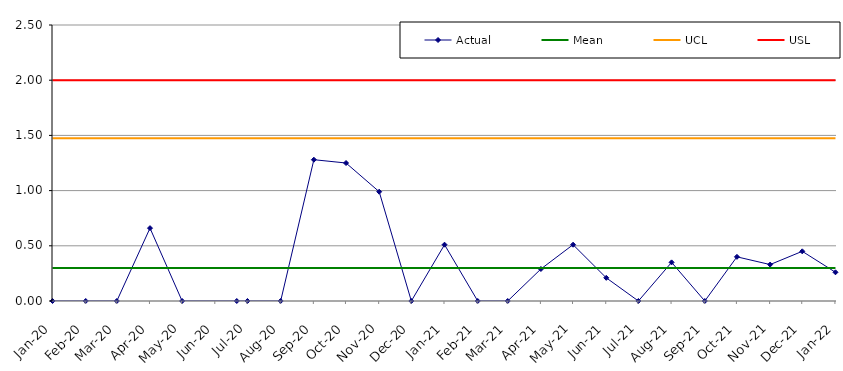
| Category | Actual | Mean | UCL | USL |
|---|---|---|---|---|
| 2020-01-01 | 0 | 0.3 | 1.475 | 2 |
| 2020-02-01 | 0 | 0.3 | 1.475 | 2 |
| 2020-03-01 | 0 | 0.3 | 1.475 | 2 |
| 2020-04-01 | 0.66 | 0.3 | 1.475 | 2 |
| 2020-05-01 | 0 | 0.3 | 1.475 | 2 |
| 2020-06-21 | 0 | 0.3 | 1.475 | 2 |
| 2020-07-01 | 0 | 0.3 | 1.475 | 2 |
| 2020-08-01 | 0 | 0.3 | 1.475 | 2 |
| 2020-09-01 | 1.28 | 0.3 | 1.475 | 2 |
| 2020-10-01 | 1.25 | 0.3 | 1.475 | 2 |
| 2020-11-01 | 0.99 | 0.3 | 1.475 | 2 |
| 2020-12-01 | 0 | 0.3 | 1.475 | 2 |
| 2021-01-01 | 0.51 | 0.3 | 1.475 | 2 |
| 2021-02-01 | 0 | 0.3 | 1.475 | 2 |
| 2021-03-01 | 0 | 0.3 | 1.475 | 2 |
| 2021-04-01 | 0.29 | 0.3 | 1.475 | 2 |
| 2021-05-01 | 0.51 | 0.3 | 1.475 | 2 |
| 2021-06-01 | 0.21 | 0.3 | 1.475 | 2 |
| 2021-07-01 | 0 | 0.3 | 1.475 | 2 |
| 2021-08-01 | 0.35 | 0.3 | 1.475 | 2 |
| 2021-09-01 | 0 | 0.3 | 1.475 | 2 |
| 2021-10-01 | 0.4 | 0.3 | 1.475 | 2 |
| 2021-11-01 | 0.33 | 0.3 | 1.475 | 2 |
| 2021-12-01 | 0.45 | 0.3 | 1.475 | 2 |
| 2022-01-01 | 0.26 | 0.3 | 1.475 | 2 |